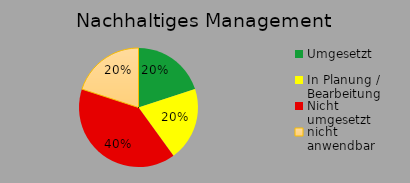
| Category | Series 1 |
|---|---|
| Umgesetzt | 1 |
| In Planung / Bearbeitung | 1 |
| Nicht umgesetzt | 2 |
| nicht anwendbar | 1 |